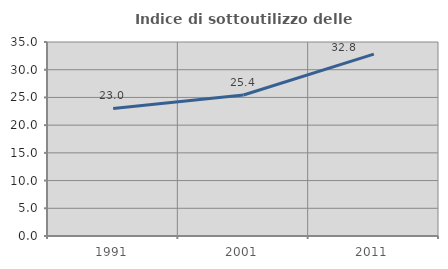
| Category | Indice di sottoutilizzo delle abitazioni  |
|---|---|
| 1991.0 | 23.011 |
| 2001.0 | 25.436 |
| 2011.0 | 32.808 |